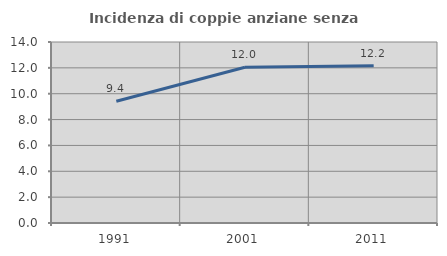
| Category | Incidenza di coppie anziane senza figli  |
|---|---|
| 1991.0 | 9.415 |
| 2001.0 | 12.044 |
| 2011.0 | 12.165 |